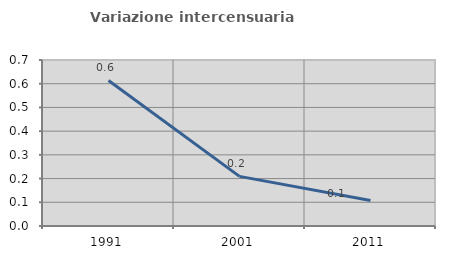
| Category | Variazione intercensuaria annua |
|---|---|
| 1991.0 | 0.614 |
| 2001.0 | 0.209 |
| 2011.0 | 0.108 |